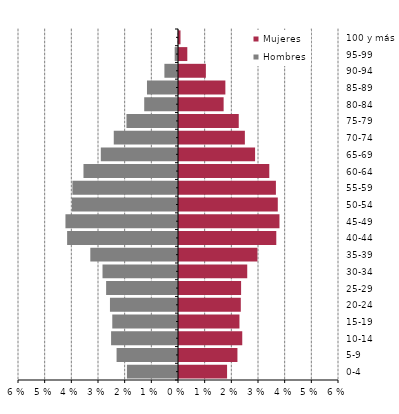
| Category | Hombres | Mujeres |
|---|---|---|
| 0-4 | -0.019 | 0.018 |
| 5-9 | -0.023 | 0.022 |
| 10-14 | -0.025 | 0.024 |
| 15-19 | -0.025 | 0.023 |
| 20-24 | -0.026 | 0.023 |
| 25-29 | -0.027 | 0.023 |
| 30-34 | -0.028 | 0.026 |
| 35-39 | -0.033 | 0.029 |
| 40-44 | -0.042 | 0.036 |
| 45-49 | -0.042 | 0.038 |
| 50-54 | -0.04 | 0.037 |
| 55-59 | -0.04 | 0.036 |
| 60-64 | -0.035 | 0.034 |
| 65-69 | -0.029 | 0.029 |
| 70-74 | -0.024 | 0.025 |
| 75-79 | -0.019 | 0.022 |
| 80-84 | -0.013 | 0.017 |
| 85-89 | -0.012 | 0.017 |
| 90-94 | -0.005 | 0.01 |
| 95-99 | -0.001 | 0.003 |
| 100 y más | 0 | 0.001 |